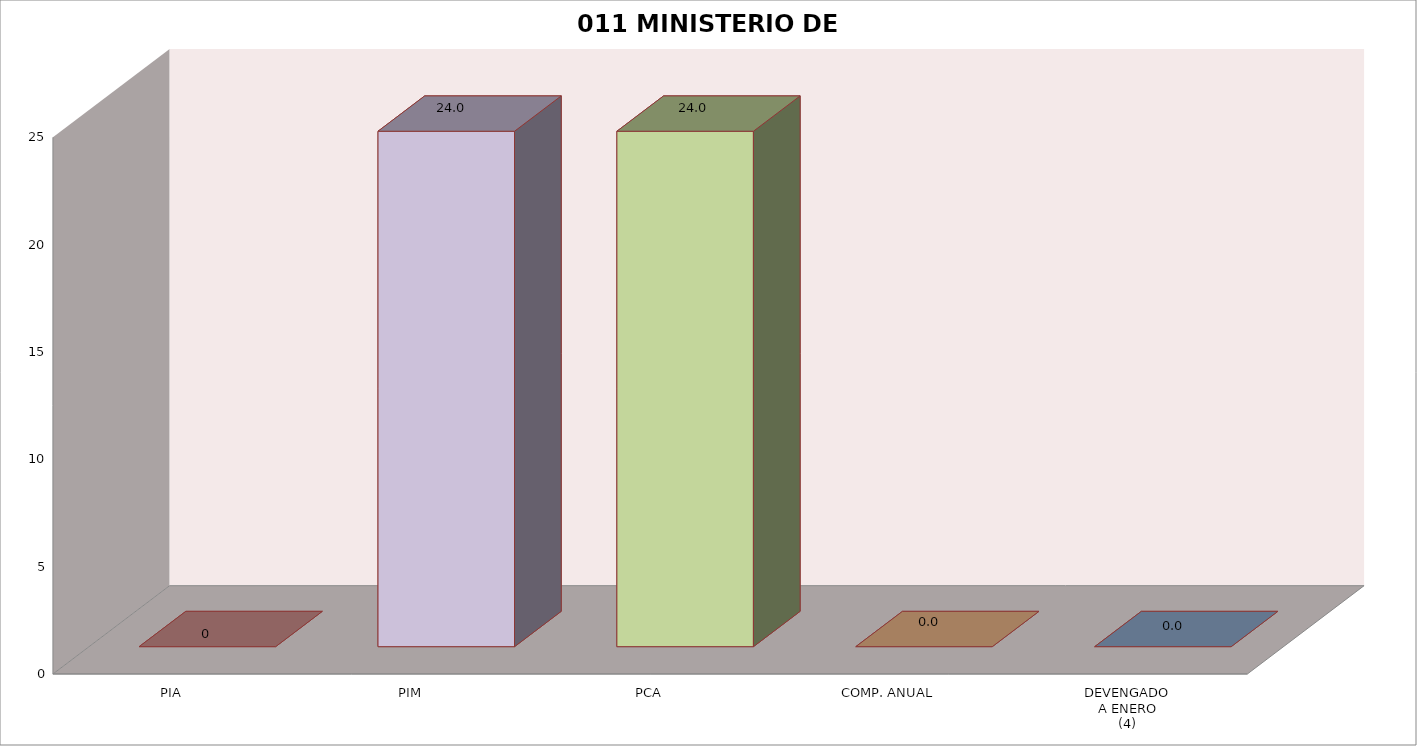
| Category | 011 MINISTERIO DE SALUD |
|---|---|
| PIA | 0 |
| PIM | 24.01 |
| PCA | 24.01 |
| COMP. ANUAL | 0 |
| DEVENGADO
A ENERO
(4) | 0 |